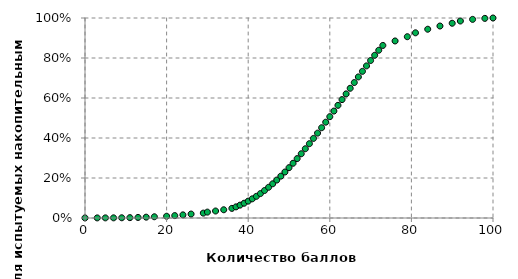
| Category | Series 0 |
|---|---|
| 0.0 | 0 |
| 3.0 | 0.001 |
| 5.0 | 0.001 |
| 7.0 | 0.001 |
| 9.0 | 0.001 |
| 11.0 | 0.002 |
| 13.0 | 0.003 |
| 15.0 | 0.004 |
| 17.0 | 0.006 |
| 20.0 | 0.009 |
| 22.0 | 0.012 |
| 24.0 | 0.016 |
| 26.0 | 0.02 |
| 29.0 | 0.024 |
| 30.0 | 0.029 |
| 32.0 | 0.035 |
| 34.0 | 0.041 |
| 36.0 | 0.048 |
| 37.0 | 0.056 |
| 38.0 | 0.064 |
| 39.0 | 0.074 |
| 40.0 | 0.084 |
| 41.0 | 0.096 |
| 42.0 | 0.108 |
| 43.0 | 0.122 |
| 44.0 | 0.137 |
| 45.0 | 0.154 |
| 46.0 | 0.171 |
| 47.0 | 0.19 |
| 48.0 | 0.209 |
| 49.0 | 0.23 |
| 50.0 | 0.252 |
| 51.0 | 0.274 |
| 52.0 | 0.297 |
| 53.0 | 0.321 |
| 54.0 | 0.346 |
| 55.0 | 0.372 |
| 56.0 | 0.398 |
| 57.0 | 0.424 |
| 58.0 | 0.451 |
| 59.0 | 0.479 |
| 60.0 | 0.507 |
| 61.0 | 0.535 |
| 62.0 | 0.563 |
| 63.0 | 0.592 |
| 64.0 | 0.621 |
| 65.0 | 0.649 |
| 66.0 | 0.677 |
| 67.0 | 0.705 |
| 68.0 | 0.733 |
| 69.0 | 0.761 |
| 70.0 | 0.787 |
| 71.0 | 0.814 |
| 72.0 | 0.839 |
| 73.0 | 0.863 |
| 76.0 | 0.885 |
| 79.0 | 0.906 |
| 81.0 | 0.926 |
| 84.0 | 0.944 |
| 87.0 | 0.96 |
| 90.0 | 0.974 |
| 92.0 | 0.985 |
| 95.0 | 0.993 |
| 98.0 | 0.998 |
| 100.0 | 1 |